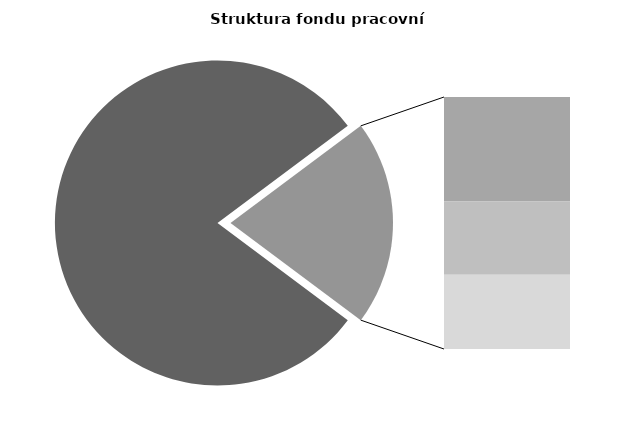
| Category | Series 0 |
|---|---|
| Průměrná měsíční odpracovaná doba bez přesčasu | 135.388 |
| Dovolená | 14.378 |
| Nemoc | 10.074 |
| Jiné | 10.229 |